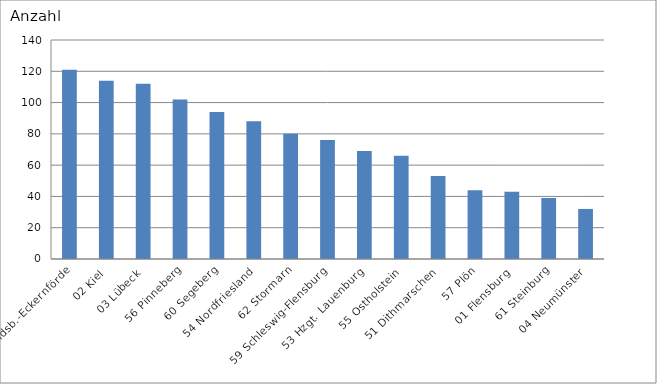
| Category | 58 Rendsb.-Eckernförde 02 Kiel 03 Lübeck 56 Pinneberg 60 Segeberg 54 Nordfriesland 62 Stormarn 59 Schleswig-Flensburg 53 Hzgt. Lauenburg 55 Ostholstein 51 Dithmarschen 57 Plön 01 Flensburg 61 Steinburg 04 Neumünster |
|---|---|
| 58 Rendsb.-Eckernförde | 121 |
| 02 Kiel | 114 |
| 03 Lübeck | 112 |
| 56 Pinneberg | 102 |
| 60 Segeberg | 94 |
| 54 Nordfriesland | 88 |
| 62 Stormarn | 80 |
| 59 Schleswig-Flensburg | 76 |
| 53 Hzgt. Lauenburg | 69 |
| 55 Ostholstein | 66 |
| 51 Dithmarschen | 53 |
| 57 Plön | 44 |
| 01 Flensburg | 43 |
| 61 Steinburg | 39 |
| 04 Neumünster | 32 |